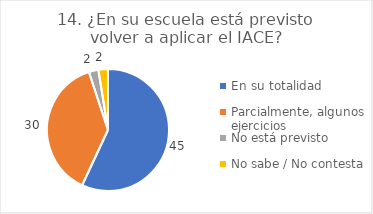
| Category | 14. ¿En su escuela está previsto volver a aplicar el IACE? |
|---|---|
| En su totalidad  | 0.57 |
| Parcialmente, algunos ejercicios  | 0.38 |
| No está previsto  | 0.025 |
| No sabe / No contesta | 0.025 |